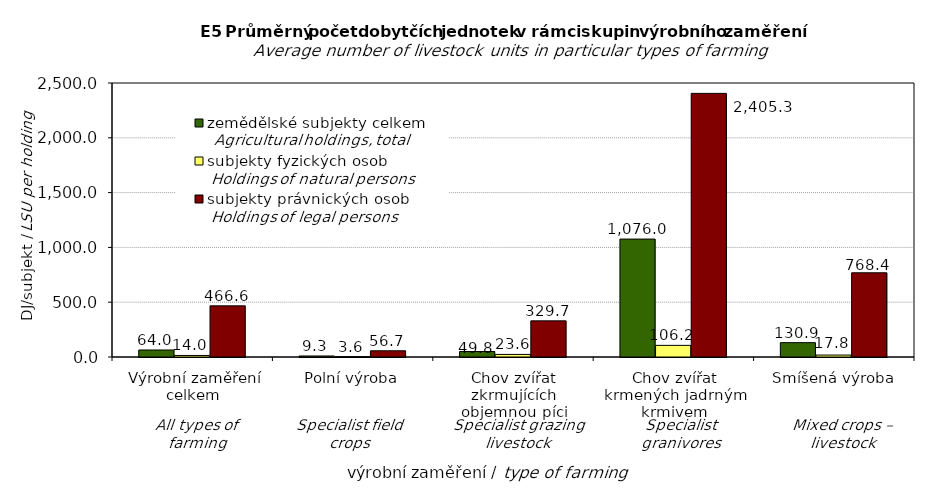
| Category | zemědělské subjekty celkem  | subjekty fyzických osob  | subjekty právnických osob  |
|---|---|---|---|
| Výrobní zaměření celkem | 64.009 | 13.978 | 466.628 |
| Polní výroba | 9.293 | 3.637 | 56.738 |
| Chov zvířat zkrmujících objemnou píci | 49.814 | 23.563 | 329.739 |
| Chov zvířat krmených jadrným krmivem | 1076.02 | 106.198 | 2405.251 |
| Smíšená výroba | 130.888 | 17.812 | 768.415 |